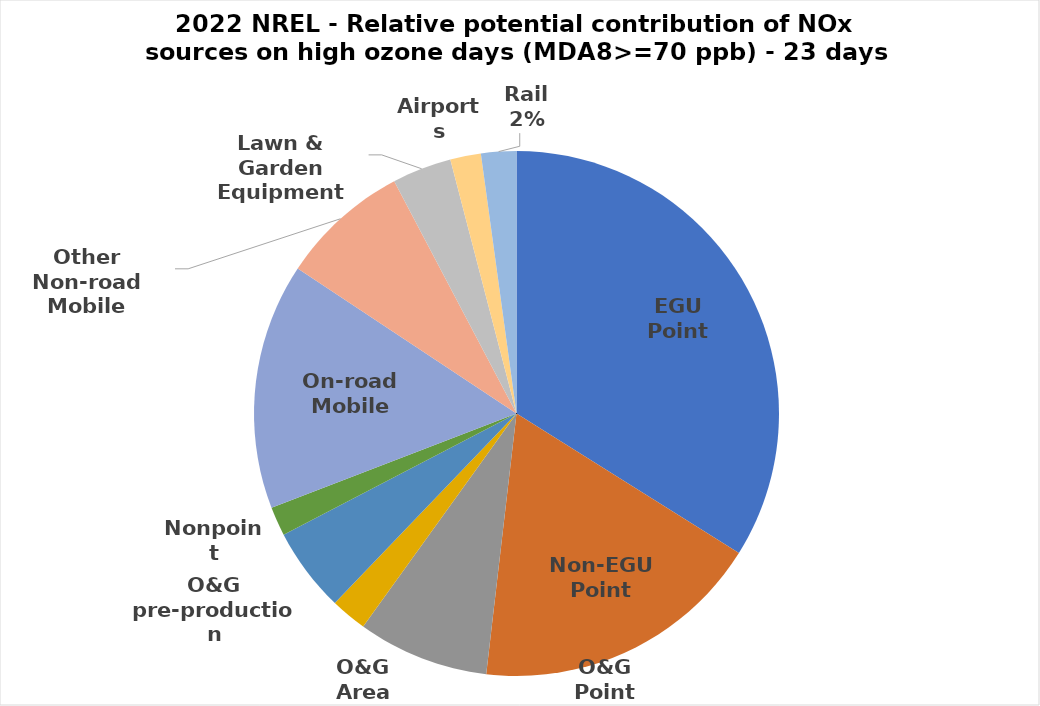
| Category | Total |
|---|---|
| EGU Point | 2645.315 |
| Non-EGU Point | 1398.66 |
| O&G Area | 630.89 |
| O&G Point | 174.433 |
| O&G pre-production | 405.693 |
| Nonpoint | 139.412 |
| On-road Mobile | 1183.127 |
| Other Non-road Mobile | 621.425 |
| Lawn & Garden Equipment | 285.288 |
| Airports | 147.147 |
| Rail | 169.261 |